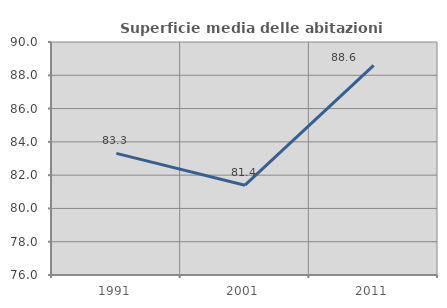
| Category | Superficie media delle abitazioni occupate |
|---|---|
| 1991.0 | 83.307 |
| 2001.0 | 81.396 |
| 2011.0 | 88.598 |